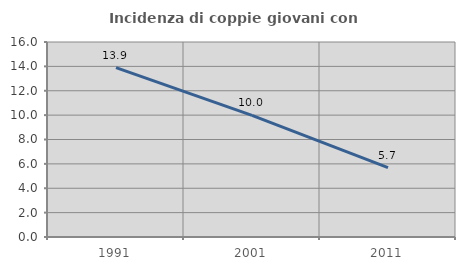
| Category | Incidenza di coppie giovani con figli |
|---|---|
| 1991.0 | 13.894 |
| 2001.0 | 9.977 |
| 2011.0 | 5.694 |